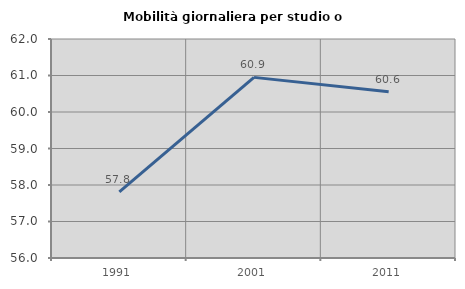
| Category | Mobilità giornaliera per studio o lavoro |
|---|---|
| 1991.0 | 57.81 |
| 2001.0 | 60.948 |
| 2011.0 | 60.556 |